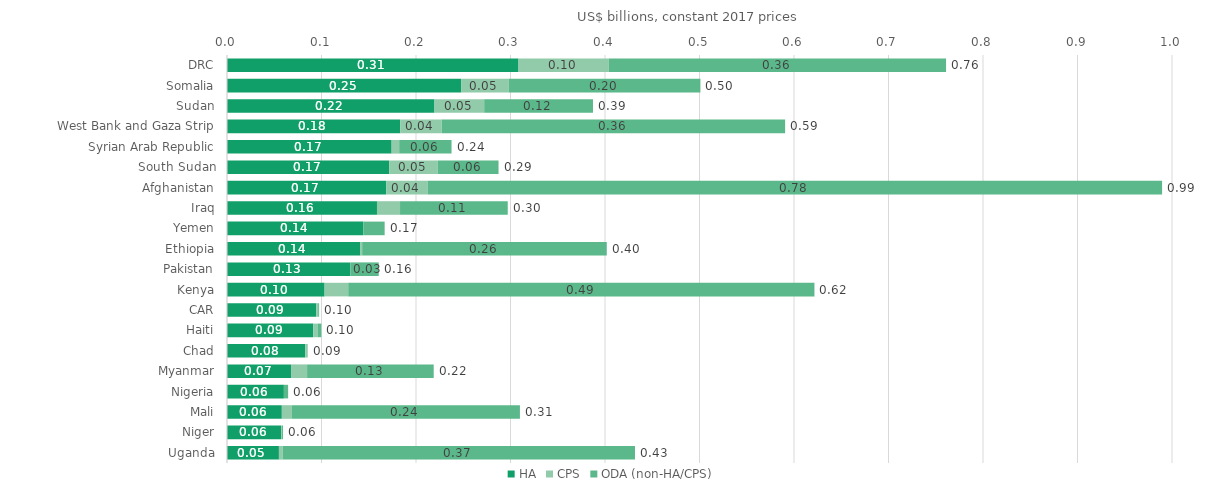
| Category | HA | CPS | ODA (non-HA/CPS) | Total |
|---|---|---|---|---|
| DRC | 308.494 | 95.585 | 356.836 | 760.915 |
| Somalia | 247.73 | 50.257 | 202.992 | 500.978 |
| Sudan | 219.568 | 52.596 | 115.121 | 387.285 |
| West Bank and Gaza Strip | 183.378 | 43.754 | 363.477 | 590.608 |
| Syrian Arab Republic | 174.219 | 7.982 | 55.404 | 237.605 |
| South Sudan | 171.626 | 51.34 | 64.374 | 287.34 |
| Afghanistan | 168.439 | 43.824 | 777.26 | 989.523 |
| Iraq | 158.702 | 24.418 | 113.963 | 297.083 |
| Yemen | 144.335 | 0.053 | 22.438 | 166.825 |
| Ethiopia | 141.197 | 1.831 | 258.846 | 401.874 |
| Pakistan | 130.676 | 0.101 | 29.776 | 160.553 |
| Kenya | 103.281 | 25.015 | 493.338 | 621.633 |
| CAR | 94.594 | 1.901 | 0.989 | 97.484 |
| Haiti | 91.337 | 4.393 | 4.092 | 99.822 |
| Chad | 82.76 | 1.877 | 0.592 | 85.23 |
| Myanmar | 67.786 | 16.978 | 133.968 | 218.733 |
| Nigeria | 60.226 | 0.105 | 4.359 | 64.69 |
| Mali | 58.024 | 10.672 | 241.286 | 309.982 |
| Niger | 57.189 | 0.81 | 1.237 | 59.236 |
| Uganda | 54.939 | 4.071 | 372.72 | 431.73 |